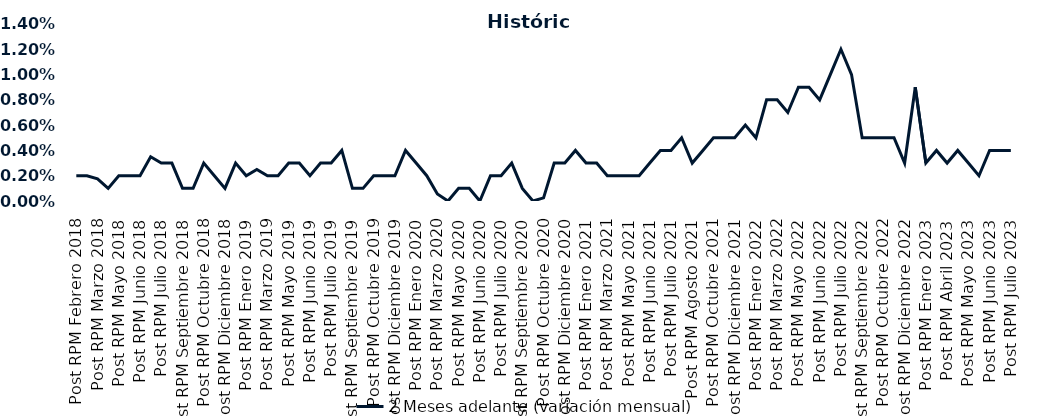
| Category | 2 Meses adelante (variación mensual) |
|---|---|
| Post RPM Febrero 2018 | 0.002 |
| Pre RPM Marzo 2018 | 0.002 |
| Post RPM Marzo 2018 | 0.002 |
| Pre RPM Mayo 2018 | 0.001 |
| Post RPM Mayo 2018 | 0.002 |
| Pre RPM Junio 2018 | 0.002 |
| Post RPM Junio 2018 | 0.002 |
| Pre RPM Julio 2018 | 0.004 |
| Post RPM Julio 2018 | 0.003 |
| Pre RPM Septiembre 2018 | 0.003 |
| Post RPM Septiembre 2018 | 0.001 |
| Pre RPM Octubre 2018 | 0.001 |
| Post RPM Octubre 2018 | 0.003 |
| Pre RPM Diciembre 2018 | 0.002 |
| Post RPM Diciembre 2018 | 0.001 |
| Pre RPM Enero 2019 | 0.003 |
| Post RPM Enero 2019 | 0.002 |
| Pre RPM Marzo 2019 | 0.002 |
| Post RPM Marzo 2019 | 0.002 |
| Pre RPM Mayo 2019 | 0.002 |
| Post RPM Mayo 2019 | 0.003 |
| Pre RPM Junio 2019 | 0.003 |
| Post RPM Junio 2019 | 0.002 |
| Pre RPM Julio 2019 | 0.003 |
| Post RPM Julio 2019 | 0.003 |
| Pre RPM Septiembre 2019 | 0.004 |
| Post RPM Septiembre 2019 | 0.001 |
| Pre RPM Octubre 2019 | 0.001 |
| Post RPM Octubre 2019 | 0.002 |
| Pre RPM Diciembre 2019 | 0.002 |
| Post RPM Diciembre 2019 | 0.002 |
| Pre RPM Enero 2020 | 0.004 |
| Post RPM Enero 2020 | 0.003 |
| Pre RPM Marzo 2020 | 0.002 |
| Post RPM Marzo 2020 | 0.001 |
| Pre RPM Mayo 2020 | 0 |
| Post RPM Mayo 2020 | 0.001 |
| Pre RPM Junio 2020 | 0.001 |
| Post RPM Junio 2020 | 0 |
| Pre RPM Julio 2020 | 0.002 |
| Post RPM Julio 2020 | 0.002 |
| Pre RPM Septiembre 2020 | 0.003 |
| Post RPM Septiembre 2020 | 0.001 |
| Pre RPM Octubre 2020 | 0 |
| Post RPM Octubre 2020 | 0 |
| Pre RPM Diciembre 2020 | 0.003 |
| Post RPM Diciembre 2020 | 0.003 |
| Pre RPM Enero 2021 | 0.004 |
| Post RPM Enero 2021 | 0.003 |
| Pre RPM Marzo 2021 | 0.003 |
| Post RPM Marzo 2021 | 0.002 |
| Pre RPM Mayo 2021 | 0.002 |
| Post RPM Mayo 2021 | 0.002 |
| Pre RPM Junio 2021 | 0.002 |
| Post RPM Junio 2021 | 0.003 |
| Pre RPM Julio 2021 | 0.004 |
| Post RPM Julio 2021 | 0.004 |
| Pre RPM Agosto 2021 | 0.005 |
| Post RPM Agosto 2021 | 0.003 |
| Pre RPM Octubre 2021 | 0.004 |
| Post RPM Octubre 2021 | 0.005 |
| Pre RPM Diciembre 2021 | 0.005 |
| Post RPM Diciembre 2021 | 0.005 |
| Pre RPM Enero 2022 | 0.006 |
| Post RPM Enero 2022 | 0.005 |
| Pre RPM Marzo 2022 | 0.008 |
| Post RPM Marzo 2022 | 0.008 |
| Pre RPM Mayo 2022 | 0.007 |
| Post RPM Mayo 2022 | 0.009 |
| Pre RPM Junio 2022 | 0.009 |
| Post RPM Junio 2022 | 0.008 |
| Pre RPM Julio 2022 | 0.01 |
| Post RPM Julio 2022 | 0.012 |
| Pre RPM Septiembre 2022 | 0.01 |
| Post RPM Septiembre 2022 | 0.005 |
| Pre RPM Octubre 2022 | 0.005 |
| Post RPM Octubre 2022 | 0.005 |
| Pre RPM Diciembre 2022 | 0.005 |
| Post RPM Diciembre 2022 | 0.003 |
| Pre RPM Enero 2023 | 0.009 |
| Post RPM Enero 2023 | 0.003 |
| Pre RPM Abril 2023 | 0.004 |
| Post RPM Abril 2023 | 0.003 |
| Pre RPM Mayo 2023 | 0.004 |
| Post RPM Mayo 2023 | 0.003 |
| Pre RPM Junio 2023 | 0.002 |
| Post RPM Junio 2023 | 0.004 |
| Pre RPM Julio 2023 | 0.004 |
| Post RPM Julio 2023 | 0.004 |